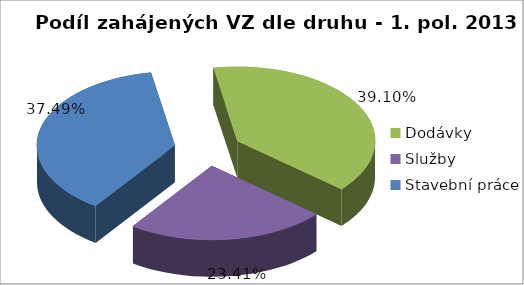
| Category | Series 0 |
|---|---|
| Dodávky | 1405 |
| Služby | 841 |
| Stavební práce | 1347 |